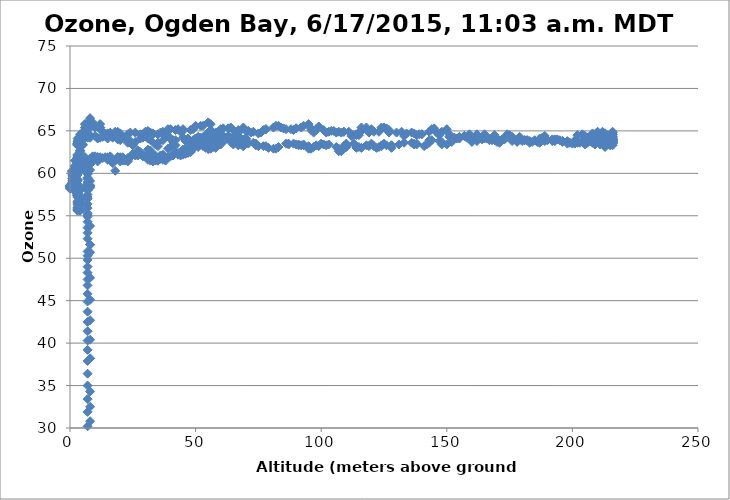
| Category | Series 0 |
|---|---|
| 8.0 | 53.8 |
| 8.0 | 50.7 |
| 8.0 | 47.7 |
| 8.0 | 45.1 |
| 8.0 | 42.7 |
| 8.0 | 40.4 |
| 8.0 | 38.2 |
| 8.0 | 38.2 |
| 8.0 | 34.3 |
| 8.0 | 32.5 |
| 8.0 | 30.8 |
| 8.0 | 29.2 |
| 8.0 | 27.7 |
| 7.0 | 26.3 |
| 7.0 | 24.9 |
| 7.0 | 23.6 |
| 7.0 | 22.4 |
| 7.0 | 21.3 |
| 7.0 | 20.4 |
| 7.0 | 19.4 |
| 7.0 | 18.4 |
| 7.0 | 17.5 |
| 7.0 | 16.7 |
| 7.0 | 15.9 |
| 7.0 | 15.2 |
| 7.0 | 14.5 |
| 7.0 | 13.9 |
| 7.0 | 13.3 |
| 7.0 | 12.8 |
| 7.0 | 12.3 |
| 7.0 | 11.8 |
| 7.0 | 11.3 |
| 7.0 | 10.9 |
| 7.0 | 10.5 |
| 7.0 | 10.1 |
| 7.0 | 9.7 |
| 7.0 | 9.3 |
| 7.0 | 9 |
| 7.0 | 8.7 |
| 7.0 | 8.4 |
| 7.0 | 8.1 |
| 7.0 | 7.9 |
| 7.0 | 7.6 |
| 7.0 | 7.4 |
| 7.0 | 7.2 |
| 7.0 | 6.9 |
| 7.0 | 6.8 |
| 7.0 | 6.5 |
| 7.0 | 6.4 |
| 7.0 | 6.2 |
| 7.0 | 6 |
| 7.0 | 6 |
| 7.0 | 5.8 |
| 7.0 | 5.6 |
| 7.0 | 5.6 |
| 7.0 | 5.4 |
| 7.0 | 5.3 |
| 7.0 | 5.2 |
| 7.0 | 5.1 |
| 7.0 | 5 |
| 7.0 | 4.9 |
| 7.0 | 4.8 |
| 7.0 | 4.8 |
| 7.0 | 4.7 |
| 7.0 | 4.5 |
| 7.0 | 4.5 |
| 7.0 | 4.4 |
| 7.0 | 4.4 |
| 7.0 | 4.4 |
| 7.0 | 4.2 |
| 7.0 | 4.1 |
| 7.0 | 4.1 |
| 7.0 | 4.1 |
| 7.0 | 4.1 |
| 7.0 | 4.1 |
| 7.0 | 4 |
| 7.0 | 3.9 |
| 7.0 | 3.8 |
| 7.0 | 3.8 |
| 7.0 | 3.7 |
| 7.0 | 3.7 |
| 7.0 | 3.7 |
| 8.0 | 3.7 |
| 8.0 | 3.7 |
| 8.0 | 3.7 |
| 8.0 | 3.7 |
| 8.0 | 3.7 |
| 8.0 | 3.7 |
| 8.0 | 3.6 |
| 8.0 | 3.5 |
| 8.0 | 3.5 |
| 8.0 | 4.4 |
| 8.0 | 6.8 |
| 8.0 | 9.5 |
| 8.0 | 12.2 |
| 8.0 | 14.9 |
| 7.0 | 17.5 |
| 7.0 | 20 |
| 7.0 | 22.3 |
| 7.0 | 24.5 |
| 7.0 | 26.7 |
| 7.0 | 28.5 |
| 7.0 | 30.2 |
| 7.0 | 31.9 |
| 7.0 | 33.4 |
| 7.0 | 35 |
| 7.0 | 36.4 |
| 7.0 | 37.9 |
| 7.0 | 39.2 |
| 7.0 | 40.3 |
| 7.0 | 41.4 |
| 7.0 | 42.5 |
| 7.0 | 43.7 |
| 7.0 | 44.9 |
| 7.0 | 45.8 |
| 7.0 | 46.8 |
| 7.0 | 47.5 |
| 7.0 | 48.3 |
| 7.0 | 49 |
| 7.0 | 49.8 |
| 7.0 | 50.3 |
| 7.0 | 50.8 |
| 8.0 | 51.6 |
| 8.0 | 51.6 |
| 7.0 | 52.3 |
| 7.0 | 53 |
| 7.0 | 53.6 |
| 7.0 | 54.3 |
| 7.0 | 54.9 |
| 7.0 | 55.1 |
| 7.0 | 55.3 |
| 7.0 | 55.9 |
| 7.0 | 56.4 |
| 7.0 | 57 |
| 7.0 | 57.2 |
| 7.0 | 57.5 |
| 7.0 | 58 |
| 7.0 | 58.3 |
| 8.0 | 58.5 |
| 8.0 | 58.6 |
| 8.0 | 58.3 |
| 8.0 | 58.5 |
| 7.0 | 58.6 |
| 7.0 | 58.7 |
| 7.0 | 58.8 |
| 7.0 | 59 |
| 8.0 | 59.1 |
| 7.0 | 59.3 |
| 7.0 | 59.4 |
| 7.0 | 59.5 |
| 7.0 | 59.9 |
| 7.0 | 60.2 |
| 7.0 | 60.2 |
| 7.0 | 60.2 |
| 7.0 | 60.5 |
| 7.0 | 61 |
| 8.0 | 61.1 |
| 8.0 | 60.4 |
| 8.0 | 61.1 |
| 9.0 | 61.4 |
| 9.0 | 62 |
| 10.0 | 62 |
| 11.0 | 61.8 |
| 11.0 | 61.4 |
| 12.0 | 61.9 |
| 13.0 | 61.8 |
| 15.0 | 61.6 |
| 16.0 | 61.5 |
| 17.0 | 61.2 |
| 18.0 | 60.3 |
| 18.0 | 61.5 |
| 19.0 | 61.9 |
| 21.0 | 61.9 |
| 23.0 | 61.4 |
| 23.0 | 61.8 |
| 25.0 | 62.3 |
| 27.0 | 62.7 |
| 29.0 | 62 |
| 30.0 | 62 |
| 31.0 | 61.6 |
| 32.0 | 61.5 |
| 33.0 | 61.4 |
| 34.0 | 61.5 |
| 35.0 | 61.5 |
| 35.0 | 61.5 |
| 36.0 | 61.7 |
| 37.0 | 61.6 |
| 38.0 | 61.5 |
| 39.0 | 61.9 |
| 40.0 | 62 |
| 41.0 | 62.1 |
| 42.0 | 62.5 |
| 43.0 | 62.4 |
| 43.0 | 62.2 |
| 44.0 | 62.1 |
| 44.0 | 62.3 |
| 44.0 | 62.3 |
| 45.0 | 62.2 |
| 46.0 | 62.4 |
| 46.0 | 62.3 |
| 47.0 | 62.4 |
| 47.0 | 62.6 |
| 47.0 | 62.9 |
| 47.0 | 62.8 |
| 47.0 | 62.7 |
| 48.0 | 62.6 |
| 48.0 | 62.5 |
| 48.0 | 63 |
| 49.0 | 63.5 |
| 49.0 | 63.7 |
| 50.0 | 63.7 |
| 50.0 | 63.6 |
| 51.0 | 63.4 |
| 51.0 | 63.5 |
| 52.0 | 63.6 |
| 52.0 | 63.4 |
| 52.0 | 63.4 |
| 52.0 | 63.8 |
| 52.0 | 64.2 |
| 52.0 | 63.9 |
| 52.0 | 63.8 |
| 52.0 | 63.7 |
| 52.0 | 63.4 |
| 52.0 | 63.4 |
| 52.0 | 63.4 |
| 53.0 | 63.5 |
| 53.0 | 63.2 |
| 54.0 | 63 |
| 54.0 | 63.2 |
| 55.0 | 62.9 |
| 55.0 | 62.9 |
| 56.0 | 63.2 |
| 56.0 | 63.5 |
| 56.0 | 63.2 |
| 56.0 | 62.9 |
| 55.0 | 62.9 |
| 55.0 | 62.9 |
| 55.0 | 63.3 |
| 55.0 | 63.2 |
| 55.0 | 63.6 |
| 55.0 | 63.5 |
| 55.0 | 63.5 |
| 55.0 | 63.3 |
| 56.0 | 63.3 |
| 56.0 | 63.3 |
| 56.0 | 63.2 |
| 56.0 | 63.3 |
| 57.0 | 63.4 |
| 57.0 | 63.4 |
| 57.0 | 63.4 |
| 57.0 | 63.1 |
| 58.0 | 63 |
| 58.0 | 63.2 |
| 58.0 | 63.1 |
| 58.0 | 63.2 |
| 58.0 | 63.3 |
| 58.0 | 63.5 |
| 59.0 | 63.6 |
| 59.0 | 63.5 |
| 58.0 | 63.4 |
| 59.0 | 63.3 |
| 59.0 | 63.3 |
| 60.0 | 63.4 |
| 60.0 | 63.7 |
| 60.0 | 63.9 |
| 60.0 | 63.6 |
| 61.0 | 64 |
| 62.0 | 64 |
| 62.0 | 64.2 |
| 63.0 | 64.4 |
| 64.0 | 64.2 |
| 65.0 | 63.8 |
| 66.0 | 64.1 |
| 66.0 | 63.7 |
| 67.0 | 63.7 |
| 68.0 | 63.9 |
| 69.0 | 64 |
| 70.0 | 64.1 |
| 70.0 | 64 |
| 70.0 | 64.1 |
| 70.0 | 63.9 |
| 69.0 | 63.9 |
| 69.0 | 63.5 |
| 69.0 | 63.2 |
| 69.0 | 63.2 |
| 68.0 | 63.6 |
| 67.0 | 64 |
| 67.0 | 64.4 |
| 66.0 | 64.4 |
| 64.0 | 64.1 |
| 62.0 | 64.1 |
| 61.0 | 64.2 |
| 60.0 | 64 |
| 59.0 | 64.1 |
| 58.0 | 64.1 |
| 57.0 | 64.3 |
| 56.0 | 64.2 |
| 55.0 | 64.3 |
| 53.0 | 64.3 |
| 51.0 | 64.3 |
| 50.0 | 64.1 |
| 50.0 | 64.1 |
| 49.0 | 63.9 |
| 48.0 | 63.6 |
| 48.0 | 63.7 |
| 47.0 | 64.1 |
| 46.0 | 63.8 |
| 45.0 | 64.2 |
| 42.0 | 63.9 |
| 41.0 | 63.7 |
| 41.0 | 63.9 |
| 40.0 | 64.1 |
| 39.0 | 64.4 |
| 38.0 | 64.3 |
| 37.0 | 63.9 |
| 35.0 | 63.6 |
| 35.0 | 63.2 |
| 34.0 | 63.4 |
| 32.0 | 63.9 |
| 32.0 | 64.6 |
| 32.0 | 64.8 |
| 31.0 | 64.1 |
| 30.0 | 64.7 |
| 31.0 | 64.7 |
| 29.0 | 64.5 |
| 29.0 | 64.2 |
| 28.0 | 64.1 |
| 26.0 | 63.7 |
| 25.0 | 63.3 |
| 25.0 | 63.4 |
| 24.0 | 63.8 |
| 23.0 | 63.6 |
| 23.0 | 63.8 |
| 22.0 | 64.1 |
| 20.0 | 63.9 |
| 19.0 | 64 |
| 17.0 | 64.2 |
| 15.0 | 64.1 |
| 14.0 | 64.4 |
| 13.0 | 64.3 |
| 11.0 | 64.1 |
| 11.0 | 64.2 |
| 10.0 | 64.4 |
| 8.0 | 64.5 |
| 8.0 | 64.2 |
| 7.0 | 64.2 |
| 6.0 | 64.3 |
| 5.0 | 63.9 |
| 5.0 | 63.4 |
| 5.0 | 63.3 |
| 5.0 | 63.4 |
| 4.0 | 63.6 |
| 4.0 | 63.6 |
| 4.0 | 63.7 |
| 4.0 | 63.4 |
| 3.0 | 63.4 |
| 3.0 | 63.5 |
| 3.0 | 63.4 |
| 3.0 | 63.5 |
| 3.0 | 63.8 |
| 4.0 | 63.2 |
| 4.0 | 62.7 |
| 4.0 | 62.6 |
| 4.0 | 62.7 |
| 4.0 | 62.4 |
| 3.0 | 62.1 |
| 3.0 | 61.9 |
| 3.0 | 61.9 |
| 3.0 | 62.2 |
| 3.0 | 61.9 |
| 3.0 | 61.8 |
| 2.0 | 61.5 |
| 2.0 | 61.5 |
| 3.0 | 61.5 |
| 3.0 | 61.3 |
| 3.0 | 61.1 |
| 3.0 | 61 |
| 3.0 | 60.8 |
| 3.0 | 60.7 |
| 2.0 | 60.5 |
| 2.0 | 60.3 |
| 2.0 | 60.4 |
| 2.0 | 60.5 |
| 2.0 | 60.6 |
| 2.0 | 60.8 |
| 2.0 | 60.9 |
| 2.0 | 60.6 |
| 2.0 | 60.6 |
| 1.0 | 60.3 |
| 1.0 | 60.3 |
| 1.0 | 60.1 |
| 1.0 | 60 |
| 1.0 | 60.2 |
| 1.0 | 60.2 |
| 1.0 | 60 |
| 1.0 | 59.9 |
| 1.0 | 60 |
| 1.0 | 60.3 |
| 1.0 | 60.2 |
| 1.0 | 60 |
| 1.0 | 59.8 |
| 1.0 | 59.7 |
| 1.0 | 59.8 |
| 1.0 | 59.4 |
| 1.0 | 59.2 |
| 1.0 | 59.2 |
| 1.0 | 59.1 |
| 1.0 | 58.9 |
| 1.0 | 58.7 |
| 2.0 | 58.7 |
| 2.0 | 58.7 |
| 2.0 | 58.6 |
| 2.0 | 58.5 |
| 2.0 | 58.4 |
| 2.0 | 58.3 |
| 2.0 | 58.2 |
| 2.0 | 58.3 |
| 2.0 | 58.3 |
| 2.0 | 58.3 |
| 2.0 | 58.4 |
| 1.0 | 58.7 |
| 1.0 | 58.6 |
| 1.0 | 58.6 |
| 1.0 | 58.5 |
| 1.0 | 58.6 |
| 2.0 | 58.7 |
| 2.0 | 58.8 |
| 2.0 | 58.7 |
| 2.0 | 58.7 |
| 2.0 | 58.7 |
| 2.0 | 58.9 |
| 3.0 | 59.1 |
| 3.0 | 59.1 |
| 3.0 | 59.2 |
| 3.0 | 59.2 |
| 2.0 | 59.4 |
| 2.0 | 59.3 |
| 2.0 | 59.3 |
| 2.0 | 59.6 |
| 2.0 | 59.4 |
| 2.0 | 59.1 |
| 2.0 | 59.1 |
| 2.0 | 59.5 |
| 1.0 | 59.4 |
| 1.0 | 59 |
| 1.0 | 58.7 |
| 0.0 | 58.5 |
| 0.0 | 58.4 |
| 0.0 | 58.5 |
| 0.0 | 58.3 |
| 0.0 | 58.2 |
| 0.0 | 58.2 |
| 0.0 | 58.5 |
| 0.0 | 58.6 |
| 0.0 | 58.5 |
| 1.0 | 58.4 |
| 1.0 | 58.4 |
| 1.0 | 58.5 |
| 1.0 | 58.5 |
| 2.0 | 58.3 |
| 2.0 | 57.9 |
| 2.0 | 58 |
| 2.0 | 58 |
| 2.0 | 57.9 |
| 3.0 | 58 |
| 3.0 | 57.9 |
| 3.0 | 58.1 |
| 3.0 | 57.9 |
| 3.0 | 57.7 |
| 3.0 | 57.8 |
| 3.0 | 57.6 |
| 3.0 | 57.5 |
| 3.0 | 57.4 |
| 3.0 | 57.3 |
| 3.0 | 57.4 |
| 3.0 | 57.6 |
| 3.0 | 57.9 |
| 3.0 | 57.7 |
| 3.0 | 57.5 |
| 3.0 | 57.4 |
| 3.0 | 58 |
| 3.0 | 58.1 |
| 3.0 | 57.8 |
| 3.0 | 58.1 |
| 3.0 | 58 |
| 3.0 | 58 |
| 3.0 | 57.8 |
| 3.0 | 57.2 |
| 4.0 | 57.3 |
| 4.0 | 57.1 |
| 4.0 | 56.9 |
| 4.0 | 56.8 |
| 4.0 | 56.7 |
| 4.0 | 56.5 |
| 3.0 | 56.5 |
| 3.0 | 56.7 |
| 3.0 | 56.3 |
| 3.0 | 55.9 |
| 3.0 | 55.8 |
| 3.0 | 55.7 |
| 3.0 | 55.8 |
| 4.0 | 55.6 |
| 4.0 | 55.6 |
| 3.0 | 55.7 |
| 3.0 | 55.8 |
| 3.0 | 55.6 |
| 3.0 | 56 |
| 4.0 | 56.2 |
| 4.0 | 56.3 |
| 4.0 | 56.2 |
| 4.0 | 56.2 |
| 3.0 | 56.5 |
| 3.0 | 56.5 |
| 3.0 | 56.5 |
| 3.0 | 56.6 |
| 4.0 | 56.9 |
| 3.0 | 57.2 |
| 3.0 | 57.4 |
| 3.0 | 57.6 |
| 3.0 | 57.8 |
| 3.0 | 57.8 |
| 3.0 | 57.9 |
| 4.0 | 58 |
| 4.0 | 58.4 |
| 4.0 | 58.2 |
| 3.0 | 58.7 |
| 3.0 | 59.1 |
| 2.0 | 59.1 |
| 2.0 | 59.3 |
| 3.0 | 59.3 |
| 3.0 | 59.8 |
| 3.0 | 60.3 |
| 4.0 | 60.4 |
| 5.0 | 60.6 |
| 5.0 | 60.5 |
| 6.0 | 60.6 |
| 5.0 | 60.6 |
| 5.0 | 61.5 |
| 6.0 | 61.9 |
| 6.0 | 61.3 |
| 8.0 | 61.7 |
| 9.0 | 61.8 |
| 11.0 | 61.9 |
| 11.0 | 61.9 |
| 14.0 | 61.9 |
| 15.0 | 61.9 |
| 16.0 | 62 |
| 19.0 | 61.9 |
| 20.0 | 61.9 |
| 20.0 | 61.4 |
| 21.0 | 61.5 |
| 22.0 | 61.5 |
| 23.0 | 61.5 |
| 24.0 | 61.9 |
| 26.0 | 62.1 |
| 27.0 | 62.1 |
| 28.0 | 62.5 |
| 31.0 | 62.8 |
| 32.0 | 62.7 |
| 32.0 | 62.4 |
| 33.0 | 62.2 |
| 34.0 | 62.1 |
| 36.0 | 62.1 |
| 37.0 | 62.2 |
| 39.0 | 62.9 |
| 40.0 | 63.1 |
| 42.0 | 63.3 |
| 45.0 | 62.8 |
| 46.0 | 62.6 |
| 46.0 | 62.9 |
| 48.0 | 62.9 |
| 49.0 | 62.9 |
| 51.0 | 63.1 |
| 52.0 | 63.4 |
| 54.0 | 63.5 |
| 55.0 | 63.9 |
| 57.0 | 63.9 |
| 60.0 | 64.1 |
| 61.0 | 64.3 |
| 61.0 | 64.4 |
| 62.0 | 64.2 |
| 64.0 | 63.7 |
| 65.0 | 63.4 |
| 67.0 | 63.3 |
| 68.0 | 63.4 |
| 70.0 | 63.5 |
| 71.0 | 63.5 |
| 73.0 | 63.6 |
| 74.0 | 63.5 |
| 74.0 | 63.3 |
| 75.0 | 63.2 |
| 77.0 | 63.2 |
| 78.0 | 63.2 |
| 79.0 | 63 |
| 81.0 | 62.9 |
| 82.0 | 62.9 |
| 83.0 | 63.1 |
| 86.0 | 63.5 |
| 87.0 | 63.4 |
| 87.0 | 63.5 |
| 89.0 | 63.5 |
| 90.0 | 63.4 |
| 91.0 | 63.4 |
| 91.0 | 63.3 |
| 92.0 | 63.3 |
| 93.0 | 63.4 |
| 93.0 | 63.3 |
| 95.0 | 63.2 |
| 95.0 | 62.9 |
| 96.0 | 62.9 |
| 97.0 | 63.1 |
| 98.0 | 63.3 |
| 99.0 | 63.2 |
| 100.0 | 63.5 |
| 101.0 | 63.4 |
| 102.0 | 63.3 |
| 103.0 | 63.4 |
| 106.0 | 63.1 |
| 107.0 | 62.9 |
| 107.0 | 62.6 |
| 108.0 | 62.6 |
| 108.0 | 62.8 |
| 109.0 | 63.2 |
| 110.0 | 63.3 |
| 110.0 | 63.1 |
| 110.0 | 63.3 |
| 110.0 | 63.5 |
| 113.0 | 63.5 |
| 114.0 | 63.2 |
| 114.0 | 63 |
| 115.0 | 63.1 |
| 116.0 | 63 |
| 118.0 | 63.3 |
| 119.0 | 63.2 |
| 120.0 | 63.5 |
| 121.0 | 63.2 |
| 122.0 | 63 |
| 123.0 | 63.1 |
| 124.0 | 63.3 |
| 124.0 | 63.2 |
| 125.0 | 63.5 |
| 126.0 | 63.3 |
| 128.0 | 63.3 |
| 128.0 | 63 |
| 128.0 | 63.3 |
| 131.0 | 63.4 |
| 133.0 | 63.6 |
| 136.0 | 63.6 |
| 137.0 | 63.4 |
| 137.0 | 63.5 |
| 138.0 | 63.4 |
| 138.0 | 63.5 |
| 141.0 | 63.2 |
| 142.0 | 63.4 |
| 143.0 | 63.6 |
| 143.0 | 63.9 |
| 144.0 | 63.9 |
| 147.0 | 63.8 |
| 148.0 | 63.7 |
| 148.0 | 63.4 |
| 150.0 | 63.4 |
| 152.0 | 63.7 |
| 153.0 | 64.2 |
| 155.0 | 64.3 |
| 157.0 | 64.4 |
| 158.0 | 64.2 |
| 160.0 | 63.7 |
| 162.0 | 63.8 |
| 164.0 | 64 |
| 164.0 | 64.1 |
| 165.0 | 64.1 |
| 166.0 | 64.3 |
| 168.0 | 64.2 |
| 169.0 | 64.5 |
| 170.0 | 64.1 |
| 172.0 | 64 |
| 173.0 | 64.1 |
| 176.0 | 64.3 |
| 178.0 | 64 |
| 179.0 | 64.3 |
| 181.0 | 63.9 |
| 182.0 | 63.9 |
| 184.0 | 63.7 |
| 186.0 | 63.7 |
| 187.0 | 63.6 |
| 189.0 | 63.8 |
| 192.0 | 64 |
| 193.0 | 63.9 |
| 193.0 | 63.8 |
| 195.0 | 63.9 |
| 196.0 | 63.8 |
| 198.0 | 63.8 |
| 199.0 | 63.6 |
| 201.0 | 63.9 |
| 202.0 | 64.5 |
| 204.0 | 64.6 |
| 205.0 | 64 |
| 206.0 | 64 |
| 206.0 | 63.9 |
| 206.0 | 64 |
| 208.0 | 64.2 |
| 209.0 | 64.1 |
| 209.0 | 63.8 |
| 210.0 | 63.8 |
| 210.0 | 63.9 |
| 211.0 | 64 |
| 212.0 | 64.2 |
| 212.0 | 64.2 |
| 212.0 | 64.4 |
| 212.0 | 64.9 |
| 213.0 | 64.7 |
| 213.0 | 64.7 |
| 213.0 | 64.1 |
| 214.0 | 64.1 |
| 214.0 | 64 |
| 214.0 | 63.9 |
| 214.0 | 63.9 |
| 214.0 | 63.8 |
| 214.0 | 64 |
| 215.0 | 64 |
| 215.0 | 64 |
| 215.0 | 63.8 |
| 215.0 | 64 |
| 215.0 | 64.3 |
| 215.0 | 64.1 |
| 215.0 | 63.9 |
| 215.0 | 63.9 |
| 214.0 | 63.9 |
| 214.0 | 63.9 |
| 215.0 | 63.8 |
| 215.0 | 63.7 |
| 215.0 | 63.7 |
| 215.0 | 63.6 |
| 215.0 | 63.7 |
| 215.0 | 63.5 |
| 215.0 | 63.8 |
| 215.0 | 63.8 |
| 215.0 | 63.9 |
| 215.0 | 64.6 |
| 215.0 | 64.3 |
| 215.0 | 64 |
| 216.0 | 63.8 |
| 216.0 | 63.9 |
| 216.0 | 63.7 |
| 216.0 | 63.9 |
| 216.0 | 64.1 |
| 216.0 | 64.1 |
| 216.0 | 63.7 |
| 216.0 | 64.3 |
| 216.0 | 64.8 |
| 216.0 | 64.9 |
| 216.0 | 64.6 |
| 216.0 | 64.3 |
| 216.0 | 64 |
| 216.0 | 63.9 |
| 215.0 | 64.1 |
| 215.0 | 63.9 |
| 215.0 | 63.9 |
| 215.0 | 64 |
| 215.0 | 64 |
| 214.0 | 63.7 |
| 214.0 | 63.7 |
| 214.0 | 63.9 |
| 214.0 | 63.7 |
| 214.0 | 64.2 |
| 214.0 | 64.2 |
| 213.0 | 63.8 |
| 213.0 | 63.8 |
| 213.0 | 63.8 |
| 212.0 | 63.7 |
| 212.0 | 63.6 |
| 212.0 | 63.6 |
| 212.0 | 63.8 |
| 212.0 | 64.3 |
| 212.0 | 64.3 |
| 211.0 | 64.3 |
| 211.0 | 64 |
| 211.0 | 63.9 |
| 211.0 | 64.3 |
| 211.0 | 64.3 |
| 211.0 | 64.6 |
| 210.0 | 64.2 |
| 210.0 | 63.8 |
| 210.0 | 63.7 |
| 210.0 | 63.9 |
| 210.0 | 64.3 |
| 210.0 | 64.3 |
| 210.0 | 64.1 |
| 210.0 | 63.9 |
| 210.0 | 64 |
| 210.0 | 64 |
| 210.0 | 64.1 |
| 210.0 | 64.2 |
| 210.0 | 64.3 |
| 209.0 | 64.1 |
| 209.0 | 63.8 |
| 209.0 | 63.8 |
| 209.0 | 63.6 |
| 209.0 | 64 |
| 209.0 | 64 |
| 209.0 | 63.8 |
| 209.0 | 64 |
| 209.0 | 64.3 |
| 209.0 | 64.3 |
| 209.0 | 64.2 |
| 209.0 | 63.8 |
| 209.0 | 63.5 |
| 209.0 | 63.6 |
| 209.0 | 63.8 |
| 209.0 | 63.8 |
| 209.0 | 63.8 |
| 209.0 | 63.7 |
| 208.0 | 63.8 |
| 208.0 | 64 |
| 208.0 | 63.6 |
| 209.0 | 63.4 |
| 209.0 | 63.7 |
| 209.0 | 63.8 |
| 209.0 | 63.9 |
| 209.0 | 63.7 |
| 209.0 | 63.8 |
| 209.0 | 63.9 |
| 209.0 | 64 |
| 209.0 | 64.1 |
| 209.0 | 64.1 |
| 209.0 | 64.4 |
| 209.0 | 64.6 |
| 209.0 | 64.4 |
| 209.0 | 64 |
| 209.0 | 63.9 |
| 210.0 | 64.5 |
| 210.0 | 64.7 |
| 210.0 | 64.7 |
| 210.0 | 64.9 |
| 210.0 | 64.4 |
| 210.0 | 64.3 |
| 210.0 | 64.5 |
| 210.0 | 64.4 |
| 210.0 | 64.2 |
| 210.0 | 63.9 |
| 210.0 | 63.8 |
| 210.0 | 63.9 |
| 210.0 | 63.9 |
| 210.0 | 64.5 |
| 210.0 | 64.3 |
| 210.0 | 64.3 |
| 210.0 | 64 |
| 210.0 | 64.1 |
| 210.0 | 63.9 |
| 210.0 | 64.3 |
| 211.0 | 64 |
| 211.0 | 64.1 |
| 211.0 | 64.5 |
| 212.0 | 64.1 |
| 212.0 | 63.7 |
| 211.0 | 63.8 |
| 211.0 | 63.9 |
| 212.0 | 63.7 |
| 212.0 | 63.7 |
| 212.0 | 63.7 |
| 212.0 | 63.8 |
| 213.0 | 63.7 |
| 213.0 | 63.7 |
| 214.0 | 63.5 |
| 214.0 | 63.4 |
| 214.0 | 63.5 |
| 215.0 | 63.7 |
| 215.0 | 63.8 |
| 215.0 | 63.6 |
| 215.0 | 63.8 |
| 215.0 | 64 |
| 215.0 | 63.8 |
| 215.0 | 63.5 |
| 215.0 | 63.5 |
| 215.0 | 63.5 |
| 215.0 | 63.3 |
| 215.0 | 63.7 |
| 215.0 | 63.8 |
| 215.0 | 63.7 |
| 215.0 | 63.7 |
| 215.0 | 63.8 |
| 215.0 | 63.9 |
| 215.0 | 63.8 |
| 215.0 | 63.8 |
| 215.0 | 63.7 |
| 215.0 | 63.8 |
| 215.0 | 63.8 |
| 215.0 | 64 |
| 215.0 | 64.2 |
| 216.0 | 64.6 |
| 216.0 | 64.3 |
| 216.0 | 64 |
| 216.0 | 64 |
| 216.0 | 63.8 |
| 216.0 | 63.9 |
| 216.0 | 63.9 |
| 216.0 | 63.7 |
| 216.0 | 63.5 |
| 216.0 | 63.3 |
| 216.0 | 63.7 |
| 216.0 | 64.2 |
| 216.0 | 64.4 |
| 216.0 | 64 |
| 216.0 | 63.7 |
| 216.0 | 63.6 |
| 216.0 | 63.5 |
| 216.0 | 63.5 |
| 216.0 | 63.7 |
| 216.0 | 63.8 |
| 216.0 | 63.9 |
| 216.0 | 63.9 |
| 216.0 | 63.6 |
| 216.0 | 63.8 |
| 216.0 | 63.6 |
| 216.0 | 63.6 |
| 216.0 | 63.9 |
| 216.0 | 63.9 |
| 216.0 | 63.9 |
| 215.0 | 64.1 |
| 215.0 | 63.9 |
| 215.0 | 63.7 |
| 215.0 | 63.6 |
| 214.0 | 63.7 |
| 214.0 | 64 |
| 214.0 | 64.1 |
| 214.0 | 63.9 |
| 213.0 | 63.5 |
| 213.0 | 63.3 |
| 213.0 | 63.2 |
| 213.0 | 63.3 |
| 213.0 | 63.3 |
| 213.0 | 63.7 |
| 213.0 | 63.7 |
| 213.0 | 63.4 |
| 213.0 | 63.1 |
| 213.0 | 63.3 |
| 213.0 | 63.6 |
| 213.0 | 63.9 |
| 213.0 | 63.7 |
| 213.0 | 63.4 |
| 213.0 | 63.4 |
| 213.0 | 63.4 |
| 213.0 | 63.2 |
| 213.0 | 63.2 |
| 212.0 | 63.6 |
| 212.0 | 63.8 |
| 212.0 | 64.1 |
| 212.0 | 63.9 |
| 212.0 | 64 |
| 212.0 | 63.9 |
| 211.0 | 63.9 |
| 211.0 | 63.8 |
| 211.0 | 64.1 |
| 211.0 | 63.6 |
| 211.0 | 64 |
| 211.0 | 64.1 |
| 211.0 | 63.8 |
| 211.0 | 63.7 |
| 211.0 | 63.7 |
| 211.0 | 63.6 |
| 211.0 | 63.5 |
| 211.0 | 63.6 |
| 211.0 | 63.5 |
| 211.0 | 63.4 |
| 211.0 | 63.5 |
| 211.0 | 63.6 |
| 211.0 | 63.6 |
| 212.0 | 63.8 |
| 211.0 | 64 |
| 211.0 | 63.9 |
| 211.0 | 64.1 |
| 211.0 | 64.4 |
| 211.0 | 64.3 |
| 210.0 | 64.4 |
| 210.0 | 64.3 |
| 209.0 | 64.1 |
| 209.0 | 64 |
| 208.0 | 64.3 |
| 208.0 | 64.6 |
| 208.0 | 64.7 |
| 208.0 | 64.3 |
| 208.0 | 63.9 |
| 207.0 | 64 |
| 207.0 | 63.8 |
| 207.0 | 64.1 |
| 207.0 | 64.1 |
| 206.0 | 64.1 |
| 206.0 | 63.8 |
| 206.0 | 63.6 |
| 206.0 | 63.9 |
| 205.0 | 64 |
| 205.0 | 63.9 |
| 206.0 | 63.9 |
| 206.0 | 64 |
| 206.0 | 64.2 |
| 206.0 | 64.2 |
| 205.0 | 64.1 |
| 205.0 | 64.4 |
| 205.0 | 64.2 |
| 205.0 | 64.1 |
| 205.0 | 63.6 |
| 205.0 | 63.4 |
| 203.0 | 63.6 |
| 202.0 | 63.6 |
| 201.0 | 63.5 |
| 200.0 | 63.5 |
| 198.0 | 63.5 |
| 196.0 | 63.7 |
| 196.0 | 63.8 |
| 194.0 | 64 |
| 193.0 | 64 |
| 192.0 | 63.8 |
| 190.0 | 63.9 |
| 189.0 | 64.4 |
| 188.0 | 64.2 |
| 187.0 | 64.1 |
| 185.0 | 63.9 |
| 183.0 | 63.8 |
| 183.0 | 63.6 |
| 182.0 | 63.9 |
| 181.0 | 63.9 |
| 180.0 | 63.8 |
| 178.0 | 63.7 |
| 178.0 | 63.8 |
| 176.0 | 63.8 |
| 175.0 | 64.5 |
| 174.0 | 64.6 |
| 173.0 | 64 |
| 173.0 | 64.1 |
| 172.0 | 63.9 |
| 171.0 | 63.6 |
| 170.0 | 63.7 |
| 169.0 | 63.9 |
| 168.0 | 63.9 |
| 167.0 | 63.9 |
| 166.0 | 64.1 |
| 165.0 | 64.6 |
| 162.0 | 64.6 |
| 161.0 | 64.2 |
| 160.0 | 64.3 |
| 159.0 | 64.6 |
| 157.0 | 64.4 |
| 155.0 | 64.2 |
| 155.0 | 64.1 |
| 154.0 | 64.1 |
| 153.0 | 64.2 |
| 151.0 | 64.3 |
| 151.0 | 64.6 |
| 150.0 | 65.2 |
| 148.0 | 64.9 |
| 147.0 | 64.5 |
| 146.0 | 64.8 |
| 145.0 | 65.3 |
| 144.0 | 65.2 |
| 143.0 | 64.9 |
| 140.0 | 64.6 |
| 140.0 | 64.6 |
| 139.0 | 64.6 |
| 138.0 | 64.5 |
| 137.0 | 64.7 |
| 136.0 | 64.8 |
| 134.0 | 64.7 |
| 133.0 | 64.4 |
| 132.0 | 64.9 |
| 130.0 | 64.8 |
| 127.0 | 64.8 |
| 127.0 | 65.1 |
| 126.0 | 65.3 |
| 125.0 | 65.4 |
| 124.0 | 65.4 |
| 123.0 | 64.9 |
| 121.0 | 64.9 |
| 120.0 | 65.2 |
| 119.0 | 64.8 |
| 118.0 | 65.4 |
| 116.0 | 65.4 |
| 116.0 | 65 |
| 115.0 | 64.8 |
| 115.0 | 64.7 |
| 115.0 | 64.5 |
| 114.0 | 64.5 |
| 114.0 | 64.6 |
| 113.0 | 64.5 |
| 112.0 | 64.4 |
| 111.0 | 64.9 |
| 109.0 | 64.9 |
| 109.0 | 64.9 |
| 108.0 | 64.8 |
| 107.0 | 64.9 |
| 106.0 | 64.8 |
| 105.0 | 65 |
| 104.0 | 65 |
| 103.0 | 64.9 |
| 102.0 | 64.8 |
| 101.0 | 65.1 |
| 99.0 | 65.5 |
| 99.0 | 65.5 |
| 98.0 | 65.2 |
| 98.0 | 65.1 |
| 97.0 | 64.8 |
| 96.0 | 65.1 |
| 96.0 | 65.3 |
| 95.0 | 65.8 |
| 93.0 | 65.6 |
| 92.0 | 65.4 |
| 90.0 | 65.3 |
| 90.0 | 65.3 |
| 89.0 | 65.1 |
| 88.0 | 65.2 |
| 86.0 | 65.2 |
| 85.0 | 65.3 |
| 84.0 | 65.4 |
| 83.0 | 65.6 |
| 82.0 | 65.6 |
| 81.0 | 65.4 |
| 78.0 | 65.2 |
| 78.0 | 65.2 |
| 77.0 | 65.1 |
| 76.0 | 64.8 |
| 75.0 | 64.7 |
| 73.0 | 64.9 |
| 72.0 | 64.8 |
| 71.0 | 65 |
| 70.0 | 65 |
| 69.0 | 65.4 |
| 67.0 | 65.1 |
| 67.0 | 64.8 |
| 66.0 | 64.9 |
| 65.0 | 65.1 |
| 64.0 | 65.4 |
| 63.0 | 65.3 |
| 61.0 | 65.3 |
| 60.0 | 65.2 |
| 59.0 | 64.9 |
| 58.0 | 64.8 |
| 56.0 | 65.1 |
| 56.0 | 65.1 |
| 56.0 | 65.8 |
| 55.0 | 64.8 |
| 55.0 | 66 |
| 53.0 | 65.6 |
| 52.0 | 65.6 |
| 50.0 | 65.6 |
| 49.0 | 65.2 |
| 48.0 | 65.1 |
| 45.0 | 65.2 |
| 45.0 | 65 |
| 44.0 | 64.9 |
| 43.0 | 65.2 |
| 42.0 | 65.1 |
| 40.0 | 65.2 |
| 39.0 | 65.2 |
| 37.0 | 64.9 |
| 36.0 | 64.8 |
| 35.0 | 64.6 |
| 33.0 | 64.6 |
| 33.0 | 64.7 |
| 32.0 | 64.7 |
| 31.0 | 65 |
| 30.0 | 64.9 |
| 29.0 | 64.6 |
| 28.0 | 64.6 |
| 26.0 | 64.8 |
| 24.0 | 64.8 |
| 23.0 | 64.6 |
| 20.0 | 64.5 |
| 20.0 | 64.7 |
| 19.0 | 64.9 |
| 18.0 | 64.9 |
| 16.0 | 64.8 |
| 15.0 | 64.7 |
| 14.0 | 64.7 |
| 12.0 | 65.8 |
| 12.0 | 65.4 |
| 12.0 | 64.2 |
| 12.0 | 65.2 |
| 12.0 | 65.4 |
| 10.0 | 65.4 |
| 9.0 | 66 |
| 8.0 | 66.5 |
| 7.0 | 65.9 |
| 6.0 | 65.8 |
| 6.0 | 65.8 |
| 7.0 | 65.8 |
| 7.0 | 65.5 |
| 7.0 | 65.1 |
| 7.0 | 65.2 |
| 6.0 | 65.4 |
| 6.0 | 65.4 |
| 6.0 | 65.2 |
| 6.0 | 64.9 |
| 5.0 | 64.5 |
| 5.0 | 64 |
| 5.0 | 64.2 |
| 5.0 | 64.2 |
| 4.0 | 64.6 |
| 4.0 | 64.3 |
| 3.0 | 63.7 |
| 3.0 | 64.1 |
| 3.0 | 63.8 |
| 3.0 | 63.3 |